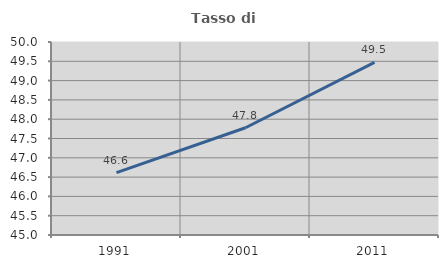
| Category | Tasso di occupazione   |
|---|---|
| 1991.0 | 46.617 |
| 2001.0 | 47.779 |
| 2011.0 | 49.473 |